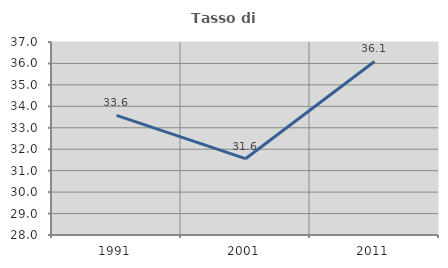
| Category | Tasso di occupazione   |
|---|---|
| 1991.0 | 33.58 |
| 2001.0 | 31.559 |
| 2011.0 | 36.091 |